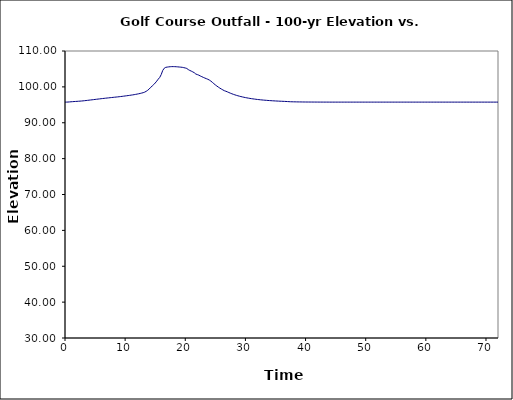
| Category | Series 1 |
|---|---|
| 0.0 | 95.75 |
| 0.25 | 95.756 |
| 0.5 | 95.774 |
| 0.75 | 95.806 |
| 1.0 | 95.841 |
| 1.25 | 95.876 |
| 1.5 | 95.908 |
| 1.75 | 95.937 |
| 2.0 | 95.966 |
| 2.25 | 95.994 |
| 2.5 | 96.025 |
| 2.75 | 96.06 |
| 3.0 | 96.102 |
| 3.25 | 96.147 |
| 3.5 | 96.194 |
| 3.75 | 96.244 |
| 4.0 | 96.295 |
| 4.25 | 96.346 |
| 4.5 | 96.398 |
| 4.75 | 96.448 |
| 5.0 | 96.5 |
| 5.25 | 96.55 |
| 5.5 | 96.6 |
| 5.75 | 96.651 |
| 6.0 | 96.7 |
| 6.25 | 96.748 |
| 6.5 | 96.797 |
| 6.75 | 96.845 |
| 7.0 | 96.891 |
| 7.25 | 96.937 |
| 7.5 | 96.983 |
| 7.75 | 97.029 |
| 8.0 | 97.074 |
| 8.25 | 97.118 |
| 8.5 | 97.162 |
| 8.75 | 97.208 |
| 9.0 | 97.255 |
| 9.25 | 97.304 |
| 9.5 | 97.356 |
| 9.75 | 97.41 |
| 10.0 | 97.466 |
| 10.25 | 97.523 |
| 10.5 | 97.581 |
| 10.75 | 97.639 |
| 11.0 | 97.701 |
| 11.25 | 97.765 |
| 11.5 | 97.835 |
| 11.75 | 97.91 |
| 12.0 | 97.99 |
| 12.25 | 98.076 |
| 12.5 | 98.17 |
| 12.75 | 98.272 |
| 13.0 | 98.382 |
| 13.25 | 98.536 |
| 13.5 | 98.763 |
| 13.75 | 99.054 |
| 14.0 | 99.407 |
| 14.25 | 99.876 |
| 14.5 | 100.234 |
| 14.75 | 100.636 |
| 15.0 | 101.081 |
| 15.25 | 101.591 |
| 15.5 | 102.143 |
| 15.75 | 102.635 |
| 16.0 | 103.438 |
| 16.25 | 104.573 |
| 16.5 | 105.194 |
| 16.75 | 105.447 |
| 17.0 | 105.518 |
| 17.25 | 105.576 |
| 17.5 | 105.621 |
| 17.75 | 105.646 |
| 18.0 | 105.648 |
| 18.25 | 105.637 |
| 18.5 | 105.612 |
| 18.75 | 105.578 |
| 19.0 | 105.54 |
| 19.25 | 105.496 |
| 19.5 | 105.449 |
| 19.75 | 105.359 |
| 20.0 | 105.262 |
| 20.25 | 105.134 |
| 20.5 | 104.817 |
| 20.75 | 104.58 |
| 21.0 | 104.394 |
| 21.25 | 104.179 |
| 21.5 | 103.945 |
| 21.75 | 103.583 |
| 22.0 | 103.431 |
| 22.25 | 103.266 |
| 22.5 | 103.039 |
| 22.75 | 102.843 |
| 23.0 | 102.647 |
| 23.25 | 102.465 |
| 23.5 | 102.292 |
| 23.75 | 102.119 |
| 24.0 | 101.903 |
| 24.25 | 101.616 |
| 24.5 | 101.269 |
| 24.75 | 100.899 |
| 25.0 | 100.551 |
| 25.25 | 100.232 |
| 25.5 | 99.934 |
| 25.75 | 99.656 |
| 26.0 | 99.397 |
| 26.25 | 99.156 |
| 26.5 | 98.937 |
| 26.75 | 98.784 |
| 27.0 | 98.611 |
| 27.25 | 98.421 |
| 27.5 | 98.244 |
| 27.75 | 98.078 |
| 28.0 | 97.919 |
| 28.25 | 97.776 |
| 28.5 | 97.644 |
| 28.75 | 97.521 |
| 29.0 | 97.405 |
| 29.25 | 97.299 |
| 29.5 | 97.198 |
| 29.75 | 97.105 |
| 30.0 | 97.017 |
| 30.25 | 96.934 |
| 30.5 | 96.857 |
| 30.75 | 96.786 |
| 31.0 | 96.719 |
| 31.25 | 96.656 |
| 31.5 | 96.599 |
| 31.75 | 96.543 |
| 32.0 | 96.493 |
| 32.25 | 96.444 |
| 32.5 | 96.399 |
| 32.75 | 96.357 |
| 33.0 | 96.318 |
| 33.25 | 96.281 |
| 33.5 | 96.246 |
| 33.75 | 96.214 |
| 34.0 | 96.183 |
| 34.25 | 96.154 |
| 34.5 | 96.126 |
| 34.75 | 96.1 |
| 35.0 | 96.075 |
| 35.25 | 96.053 |
| 35.5 | 96.031 |
| 35.75 | 96.01 |
| 36.0 | 95.99 |
| 36.25 | 95.972 |
| 36.5 | 95.952 |
| 36.75 | 95.933 |
| 37.0 | 95.908 |
| 37.25 | 95.878 |
| 37.5 | 95.856 |
| 37.75 | 95.842 |
| 38.0 | 95.832 |
| 38.25 | 95.824 |
| 38.5 | 95.816 |
| 38.75 | 95.809 |
| 39.0 | 95.803 |
| 39.25 | 95.797 |
| 39.5 | 95.792 |
| 39.75 | 95.788 |
| 40.0 | 95.784 |
| 40.25 | 95.779 |
| 40.5 | 95.777 |
| 40.75 | 95.774 |
| 41.0 | 95.771 |
| 41.25 | 95.77 |
| 41.5 | 95.767 |
| 41.75 | 95.765 |
| 42.0 | 95.763 |
| 42.25 | 95.761 |
| 42.5 | 95.76 |
| 42.75 | 95.758 |
| 43.0 | 95.757 |
| 43.25 | 95.756 |
| 43.5 | 95.756 |
| 43.75 | 95.754 |
| 44.0 | 95.753 |
| 44.25 | 95.753 |
| 44.5 | 95.751 |
| 44.75 | 95.751 |
| 45.0 | 95.75 |
| 45.25 | 95.75 |
| 45.5 | 95.75 |
| 45.75 | 95.75 |
| 46.0 | 95.75 |
| 46.25 | 95.75 |
| 46.5 | 95.75 |
| 46.75 | 95.75 |
| 47.0 | 95.75 |
| 47.25 | 95.75 |
| 47.5 | 95.75 |
| 47.75 | 95.75 |
| 48.0 | 95.75 |
| 48.25 | 95.75 |
| 48.5 | 95.75 |
| 48.75 | 95.75 |
| 49.0 | 95.75 |
| 49.25 | 95.75 |
| 49.5 | 95.75 |
| 49.75 | 95.75 |
| 50.0 | 95.75 |
| 50.25 | 95.75 |
| 50.5 | 95.75 |
| 50.75 | 95.75 |
| 51.0 | 95.75 |
| 51.25 | 95.75 |
| 51.5 | 95.75 |
| 51.75 | 95.75 |
| 52.0 | 95.75 |
| 52.25 | 95.75 |
| 52.5 | 95.75 |
| 52.75 | 95.75 |
| 53.0 | 95.75 |
| 53.25 | 95.75 |
| 53.5 | 95.75 |
| 53.75 | 95.75 |
| 54.0 | 95.75 |
| 54.25 | 95.75 |
| 54.5 | 95.75 |
| 54.75 | 95.75 |
| 55.0 | 95.75 |
| 55.25 | 95.75 |
| 55.5 | 95.75 |
| 55.75 | 95.75 |
| 56.0 | 95.75 |
| 56.25 | 95.75 |
| 56.5 | 95.75 |
| 56.75 | 95.75 |
| 57.0 | 95.75 |
| 57.25 | 95.75 |
| 57.5 | 95.75 |
| 57.75 | 95.75 |
| 58.0 | 95.75 |
| 58.25 | 95.75 |
| 58.5 | 95.75 |
| 58.75 | 95.75 |
| 59.0 | 95.75 |
| 59.25 | 95.75 |
| 59.5 | 95.75 |
| 59.75 | 95.75 |
| 60.0 | 95.75 |
| 60.25 | 95.75 |
| 60.5 | 95.75 |
| 60.75 | 95.75 |
| 61.0 | 95.75 |
| 61.25 | 95.75 |
| 61.5 | 95.75 |
| 61.75 | 95.75 |
| 62.0 | 95.75 |
| 62.25 | 95.75 |
| 62.5 | 95.75 |
| 62.75 | 95.75 |
| 63.0 | 95.75 |
| 63.25 | 95.75 |
| 63.5 | 95.75 |
| 63.75 | 95.75 |
| 64.0 | 95.75 |
| 64.25 | 95.75 |
| 64.5 | 95.75 |
| 64.75 | 95.75 |
| 65.0 | 95.75 |
| 65.25 | 95.75 |
| 65.5 | 95.75 |
| 65.75 | 95.75 |
| 66.0 | 95.75 |
| 66.25 | 95.75 |
| 66.5 | 95.75 |
| 66.75 | 95.75 |
| 67.0 | 95.75 |
| 67.25 | 95.75 |
| 67.5 | 95.75 |
| 67.75 | 95.75 |
| 68.0 | 95.75 |
| 68.25 | 95.75 |
| 68.5 | 95.75 |
| 68.75 | 95.75 |
| 69.0 | 95.75 |
| 69.25 | 95.75 |
| 69.5 | 95.75 |
| 69.75 | 95.75 |
| 70.0 | 95.75 |
| 70.25 | 95.75 |
| 70.5 | 95.75 |
| 70.75 | 95.75 |
| 71.0 | 95.75 |
| 71.25 | 95.75 |
| 71.5 | 95.75 |
| 71.75 | 95.75 |
| 72.0 | 95.75 |
| 72.25 | 95.75 |
| 72.5 | 95.75 |
| 72.75 | 95.75 |
| 73.0 | 95.75 |
| 73.25 | 95.75 |
| 73.5 | 95.75 |
| 73.75 | 95.75 |
| 74.0 | 95.75 |
| 74.25 | 95.75 |
| 74.5 | 95.75 |
| 74.75 | 95.75 |
| 75.0 | 95.75 |
| 75.25 | 95.75 |
| 75.5 | 95.75 |
| 75.75 | 95.75 |
| 76.0 | 95.75 |
| 76.25 | 95.75 |
| 76.5 | 95.75 |
| 76.75 | 95.75 |
| 77.0 | 95.75 |
| 77.25 | 95.75 |
| 77.5 | 95.75 |
| 77.75 | 95.75 |
| 78.0 | 95.75 |
| 78.25 | 95.75 |
| 78.5 | 95.75 |
| 78.75 | 95.75 |
| 79.0 | 95.75 |
| 79.25 | 95.75 |
| 79.5 | 95.75 |
| 79.75 | 95.75 |
| 80.0 | 95.75 |
| 80.25 | 95.75 |
| 80.5 | 95.75 |
| 80.75 | 95.75 |
| 81.0 | 95.75 |
| 81.25 | 95.75 |
| 81.5 | 95.75 |
| 81.75 | 95.75 |
| 82.0 | 95.75 |
| 82.25 | 95.75 |
| 82.5 | 95.75 |
| 82.75 | 95.75 |
| 83.0 | 95.75 |
| 83.25 | 95.75 |
| 83.5 | 95.75 |
| 83.75 | 95.75 |
| 84.0 | 95.75 |
| 84.25 | 95.75 |
| 84.5 | 95.75 |
| 84.75 | 95.75 |
| 85.0 | 95.75 |
| 85.25 | 95.75 |
| 85.5 | 95.75 |
| 85.75 | 95.75 |
| 86.0 | 95.75 |
| 86.25 | 95.75 |
| 86.5 | 95.75 |
| 86.75 | 95.75 |
| 87.0 | 95.75 |
| 87.25 | 95.75 |
| 87.5 | 95.75 |
| 87.75 | 95.75 |
| 88.0 | 95.75 |
| 88.25 | 95.75 |
| 88.5 | 95.75 |
| 88.75 | 95.75 |
| 89.0 | 95.75 |
| 89.25 | 95.75 |
| 89.5 | 95.75 |
| 89.75 | 95.75 |
| 90.0 | 95.75 |
| 90.25 | 95.75 |
| 90.5 | 95.75 |
| 90.75 | 95.75 |
| 91.0 | 95.75 |
| 91.25 | 95.75 |
| 91.5 | 95.75 |
| 91.75 | 95.75 |
| 92.0 | 95.75 |
| 92.25 | 95.75 |
| 92.5 | 95.75 |
| 92.75 | 95.75 |
| 93.0 | 95.75 |
| 93.25 | 95.75 |
| 93.5 | 95.75 |
| 93.75 | 95.75 |
| 94.0 | 95.75 |
| 94.25 | 95.75 |
| 94.5 | 95.75 |
| 94.75 | 95.75 |
| 95.0 | 95.75 |
| 95.25 | 95.75 |
| 95.5 | 95.75 |
| 95.75 | 95.75 |
| 96.0 | 95.75 |
| 96.25 | 95.75 |
| 96.5 | 95.75 |
| 96.75 | 95.75 |
| 97.0 | 95.75 |
| 97.25 | 95.75 |
| 97.5 | 95.75 |
| 97.75 | 95.75 |
| 98.0 | 95.75 |
| 98.25 | 95.75 |
| 98.5 | 95.75 |
| 98.75 | 95.75 |
| 99.0 | 95.75 |
| 99.25 | 95.75 |
| 99.5 | 95.75 |
| 99.75 | 95.75 |
| 100.0 | 95.75 |
| 100.25 | 95.75 |
| 100.5 | 95.75 |
| 100.75 | 95.75 |
| 101.0 | 95.75 |
| 101.25 | 95.75 |
| 101.5 | 95.75 |
| 101.75 | 95.75 |
| 102.0 | 95.75 |
| 102.25 | 95.75 |
| 102.5 | 95.75 |
| 102.75 | 95.75 |
| 103.0 | 95.75 |
| 103.25 | 95.75 |
| 103.5 | 95.75 |
| 103.75 | 95.75 |
| 104.0 | 95.75 |
| 104.25 | 95.75 |
| 104.5 | 95.75 |
| 104.75 | 95.75 |
| 105.0 | 95.75 |
| 105.25 | 95.75 |
| 105.5 | 95.75 |
| 105.75 | 95.75 |
| 106.0 | 95.75 |
| 106.25 | 95.75 |
| 106.5 | 95.75 |
| 106.75 | 95.75 |
| 107.0 | 95.75 |
| 107.25 | 95.75 |
| 107.5 | 95.75 |
| 107.75 | 95.75 |
| 108.0 | 95.75 |
| 108.25 | 95.75 |
| 108.5 | 95.75 |
| 108.75 | 95.75 |
| 109.0 | 95.75 |
| 109.25 | 95.75 |
| 109.5 | 95.75 |
| 109.75 | 95.75 |
| 110.0 | 95.75 |
| 110.25 | 95.75 |
| 110.5 | 95.75 |
| 110.75 | 95.75 |
| 111.0 | 95.75 |
| 111.25 | 95.75 |
| 111.5 | 95.75 |
| 111.75 | 95.75 |
| 112.0 | 95.75 |
| 112.25 | 95.75 |
| 112.5 | 95.75 |
| 112.75 | 95.75 |
| 113.0 | 95.75 |
| 113.25 | 95.75 |
| 113.5 | 95.75 |
| 113.75 | 95.75 |
| 114.0 | 95.75 |
| 114.25 | 95.75 |
| 114.5 | 95.75 |
| 114.75 | 95.75 |
| 115.0 | 95.75 |
| 115.25 | 95.75 |
| 115.5 | 95.75 |
| 115.75 | 95.75 |
| 116.0 | 95.75 |
| 116.25 | 95.75 |
| 116.5 | 95.75 |
| 116.75 | 95.75 |
| 117.0 | 95.75 |
| 117.25 | 95.75 |
| 117.5 | 95.75 |
| 117.75 | 95.75 |
| 118.0 | 95.75 |
| 118.25 | 95.75 |
| 118.5 | 95.75 |
| 118.75 | 95.75 |
| 119.0 | 95.75 |
| 119.25 | 95.75 |
| 119.5 | 95.75 |
| 119.75 | 95.75 |
| 120.0 | 95.75 |
| 120.25 | 95.75 |
| 120.5 | 95.75 |
| 120.75 | 95.75 |
| 121.0 | 95.75 |
| 121.25 | 95.75 |
| 121.5 | 95.75 |
| 121.75 | 95.75 |
| 122.0 | 95.75 |
| 122.25 | 95.75 |
| 122.5 | 95.75 |
| 122.75 | 95.75 |
| 123.0 | 95.75 |
| 123.25 | 95.75 |
| 123.5 | 95.75 |
| 123.75 | 95.75 |
| 124.0 | 95.75 |
| 124.25 | 95.75 |
| 124.5 | 95.75 |
| 124.75 | 95.75 |
| 125.0 | 95.75 |
| 125.25 | 95.75 |
| 125.5 | 95.75 |
| 125.75 | 95.75 |
| 126.0 | 95.75 |
| 126.25 | 95.75 |
| 126.5 | 95.75 |
| 126.75 | 95.75 |
| 127.0 | 95.75 |
| 127.25 | 95.75 |
| 127.5 | 95.75 |
| 127.75 | 95.75 |
| 128.0 | 95.75 |
| 128.25 | 95.75 |
| 128.5 | 95.75 |
| 128.75 | 95.75 |
| 129.0 | 95.75 |
| 129.25 | 95.75 |
| 129.5 | 95.75 |
| 129.75 | 95.75 |
| 130.0 | 95.75 |
| 130.25 | 95.75 |
| 130.5 | 95.75 |
| 130.75 | 95.75 |
| 131.0 | 95.75 |
| 131.25 | 95.75 |
| 131.5 | 95.75 |
| 131.75 | 95.75 |
| 132.0 | 95.75 |
| 132.25 | 95.75 |
| 132.5 | 95.75 |
| 132.75 | 95.75 |
| 133.0 | 95.75 |
| 133.25 | 95.75 |
| 133.5 | 95.75 |
| 133.75 | 95.75 |
| 134.0 | 95.75 |
| 134.25 | 95.75 |
| 134.5 | 95.75 |
| 134.75 | 95.75 |
| 135.0 | 95.75 |
| 135.25 | 95.75 |
| 135.5 | 95.75 |
| 135.75 | 95.75 |
| 136.0 | 95.75 |
| 136.25 | 95.75 |
| 136.5 | 95.75 |
| 136.75 | 95.75 |
| 137.0 | 95.75 |
| 137.25 | 95.75 |
| 137.5 | 95.75 |
| 137.75 | 95.75 |
| 138.0 | 95.75 |
| 138.25 | 95.75 |
| 138.5 | 95.75 |
| 138.75 | 95.75 |
| 139.0 | 95.75 |
| 139.25 | 95.75 |
| 139.5 | 95.75 |
| 139.75 | 95.75 |
| 140.0 | 95.75 |
| 140.25 | 95.75 |
| 140.5 | 95.75 |
| 140.75 | 95.75 |
| 141.0 | 95.75 |
| 141.25 | 95.75 |
| 141.5 | 95.75 |
| 141.75 | 95.75 |
| 142.0 | 95.75 |
| 142.25 | 95.75 |
| 142.5 | 95.75 |
| 142.75 | 95.75 |
| 143.0 | 95.75 |
| 143.25 | 95.75 |
| 143.5 | 95.75 |
| 143.75 | 95.75 |
| 144.0 | 95.75 |
| 144.25 | 95.75 |
| 144.5 | 95.75 |
| 144.75 | 95.75 |
| 145.0 | 95.75 |
| 145.25 | 95.75 |
| 145.5 | 95.75 |
| 145.75 | 95.75 |
| 146.0 | 95.75 |
| 146.25 | 95.75 |
| 146.5 | 95.75 |
| 146.75 | 95.75 |
| 147.0 | 95.75 |
| 147.25 | 95.75 |
| 147.5 | 95.75 |
| 147.75 | 95.75 |
| 148.0 | 95.75 |
| 148.25 | 95.75 |
| 148.5 | 95.75 |
| 148.75 | 95.75 |
| 149.0 | 95.75 |
| 149.25 | 95.75 |
| 149.5 | 95.75 |
| 149.75 | 95.75 |
| 150.0 | 95.75 |
| 150.25 | 95.75 |
| 150.5 | 95.75 |
| 150.75 | 95.75 |
| 151.0 | 95.75 |
| 151.25 | 95.75 |
| 151.5 | 95.75 |
| 151.75 | 95.75 |
| 152.0 | 95.75 |
| 152.25 | 95.75 |
| 152.5 | 95.75 |
| 152.75 | 95.75 |
| 153.0 | 95.75 |
| 153.25 | 95.75 |
| 153.5 | 95.75 |
| 153.75 | 95.75 |
| 154.0 | 95.75 |
| 154.25 | 95.75 |
| 154.5 | 95.75 |
| 154.75 | 95.75 |
| 155.0 | 95.75 |
| 155.25 | 95.75 |
| 155.5 | 95.75 |
| 155.75 | 95.75 |
| 156.0 | 95.75 |
| 156.25 | 95.75 |
| 156.5 | 95.75 |
| 156.75 | 95.75 |
| 157.0 | 95.75 |
| 157.25 | 95.75 |
| 157.5 | 95.75 |
| 157.75 | 95.75 |
| 158.0 | 95.75 |
| 158.25 | 95.75 |
| 158.5 | 95.75 |
| 158.75 | 95.75 |
| 159.0 | 95.75 |
| 159.25 | 95.75 |
| 159.5 | 95.75 |
| 159.75 | 95.75 |
| 160.0 | 95.75 |
| 160.25 | 95.75 |
| 160.5 | 95.75 |
| 160.75 | 95.75 |
| 161.0 | 95.75 |
| 161.25 | 95.75 |
| 161.5 | 95.75 |
| 161.75 | 95.75 |
| 162.0 | 95.75 |
| 162.25 | 95.75 |
| 162.5 | 95.75 |
| 162.75 | 95.75 |
| 163.0 | 95.75 |
| 163.25 | 95.75 |
| 163.5 | 95.75 |
| 163.75 | 95.75 |
| 164.0 | 95.75 |
| 164.25 | 95.75 |
| 164.5 | 95.75 |
| 164.75 | 95.75 |
| 165.0 | 95.75 |
| 165.25 | 95.75 |
| 165.5 | 95.75 |
| 165.75 | 95.75 |
| 166.0 | 95.75 |
| 166.25 | 95.75 |
| 166.5 | 95.75 |
| 166.75 | 95.75 |
| 167.0 | 95.75 |
| 167.25 | 95.75 |
| 167.5 | 95.75 |
| 167.75 | 95.75 |
| 168.0 | 95.75 |
| 168.25 | 95.75 |
| 168.5 | 95.75 |
| 168.75 | 95.75 |
| 169.0 | 95.75 |
| 169.25 | 95.75 |
| 169.5 | 95.75 |
| 169.75 | 95.75 |
| 170.0 | 95.75 |
| 170.25 | 95.75 |
| 170.5 | 95.75 |
| 170.75 | 95.75 |
| 171.0 | 95.75 |
| 171.25 | 95.75 |
| 171.5 | 95.75 |
| 171.75 | 95.75 |
| 172.0 | 95.75 |
| 172.25 | 95.75 |
| 172.5 | 95.75 |
| 172.75 | 95.75 |
| 173.0 | 95.75 |
| 173.25 | 95.75 |
| 173.5 | 95.75 |
| 173.75 | 95.75 |
| 174.0 | 95.75 |
| 174.25 | 95.75 |
| 174.5 | 95.75 |
| 174.75 | 95.75 |
| 175.0 | 95.75 |
| 175.25 | 95.75 |
| 175.5 | 95.75 |
| 175.75 | 95.75 |
| 176.0 | 95.75 |
| 176.25 | 95.75 |
| 176.5 | 95.75 |
| 176.75 | 95.75 |
| 177.0 | 95.75 |
| 177.25 | 95.75 |
| 177.5 | 95.75 |
| 177.75 | 95.75 |
| 178.0 | 95.75 |
| 178.25 | 95.75 |
| 178.5 | 95.75 |
| 178.75 | 95.75 |
| 179.0 | 95.75 |
| 179.25 | 95.75 |
| 179.5 | 95.75 |
| 179.75 | 95.75 |
| 180.0 | 95.75 |
| 180.25 | 95.75 |
| 180.5 | 95.75 |
| 180.75 | 95.75 |
| 181.0 | 95.75 |
| 181.25 | 95.75 |
| 181.5 | 95.75 |
| 181.75 | 95.75 |
| 182.0 | 95.75 |
| 182.25 | 95.75 |
| 182.5 | 95.75 |
| 182.75 | 95.75 |
| 183.0 | 95.75 |
| 183.25 | 95.75 |
| 183.5 | 95.75 |
| 183.75 | 95.75 |
| 184.0 | 95.75 |
| 184.25 | 95.75 |
| 184.5 | 95.75 |
| 184.75 | 95.75 |
| 185.0 | 95.75 |
| 185.25 | 95.75 |
| 185.5 | 95.75 |
| 185.75 | 95.75 |
| 186.0 | 95.75 |
| 186.25 | 95.75 |
| 186.5 | 95.75 |
| 186.75 | 95.75 |
| 187.0 | 95.75 |
| 187.25 | 95.75 |
| 187.5 | 95.75 |
| 187.75 | 95.75 |
| 188.0 | 95.75 |
| 188.25 | 95.75 |
| 188.5 | 95.75 |
| 188.75 | 95.75 |
| 189.0 | 95.75 |
| 189.25 | 95.75 |
| 189.5 | 95.75 |
| 189.75 | 95.75 |
| 190.0 | 95.75 |
| 190.25 | 95.75 |
| 190.5 | 95.75 |
| 190.75 | 95.75 |
| 191.0 | 95.75 |
| 191.25 | 95.75 |
| 191.5 | 95.75 |
| 191.75 | 95.75 |